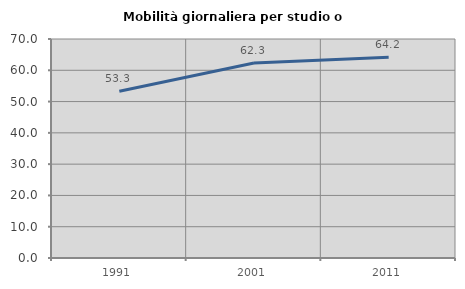
| Category | Mobilità giornaliera per studio o lavoro |
|---|---|
| 1991.0 | 53.299 |
| 2001.0 | 62.308 |
| 2011.0 | 64.152 |